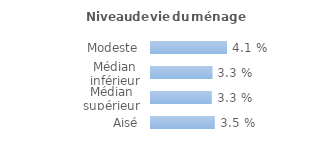
| Category | Series 0 |
|---|---|
| Modeste | 0.041 |
| Médian inférieur | 0.033 |
| Médian supérieur | 0.033 |
| Aisé | 0.035 |